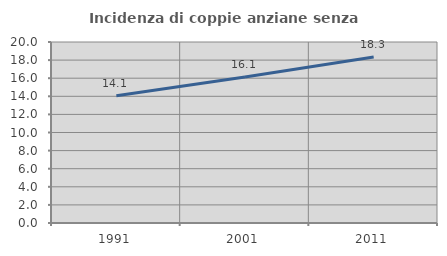
| Category | Incidenza di coppie anziane senza figli  |
|---|---|
| 1991.0 | 14.071 |
| 2001.0 | 16.134 |
| 2011.0 | 18.332 |